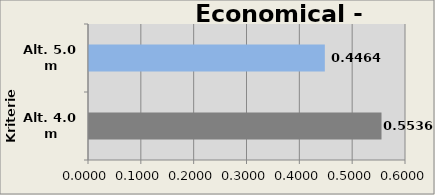
| Category | Contingency |
|---|---|
| Alt. 4.0 m | 0.554 |
| Alt. 5.0 m | 0.446 |